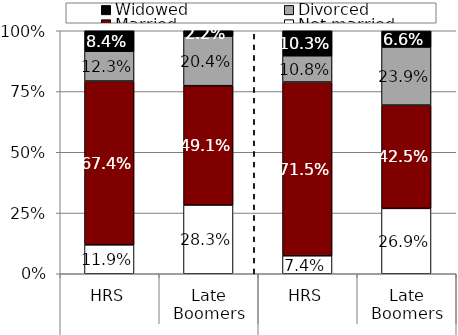
| Category | Not married | Married | Divorced | Widowed |
|---|---|---|---|---|
| 0 | 0.119 | 0.674 | 0.123 | 0.084 |
| 1 | 0.283 | 0.491 | 0.204 | 0.022 |
| 2 | 0.074 | 0.715 | 0.108 | 0.103 |
| 3 | 0.269 | 0.425 | 0.239 | 0.066 |